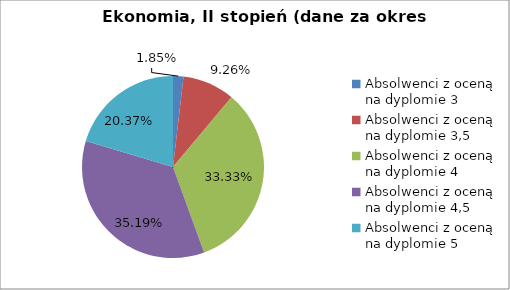
| Category | Series 0 |
|---|---|
| Absolwenci z oceną na dyplomie 3 | 1.852 |
| Absolwenci z oceną na dyplomie 3,5 | 9.259 |
| Absolwenci z oceną na dyplomie 4 | 33.333 |
| Absolwenci z oceną na dyplomie 4,5 | 35.185 |
| Absolwenci z oceną na dyplomie 5 | 20.37 |